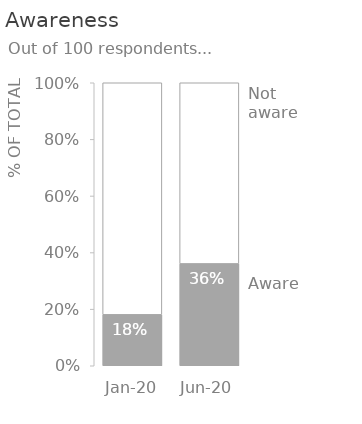
| Category | Aware | Not aware |
|---|---|---|
| 2020-01-01 | 0.18 | 0.82 |
| 2020-06-01 | 0.36 | 0.64 |